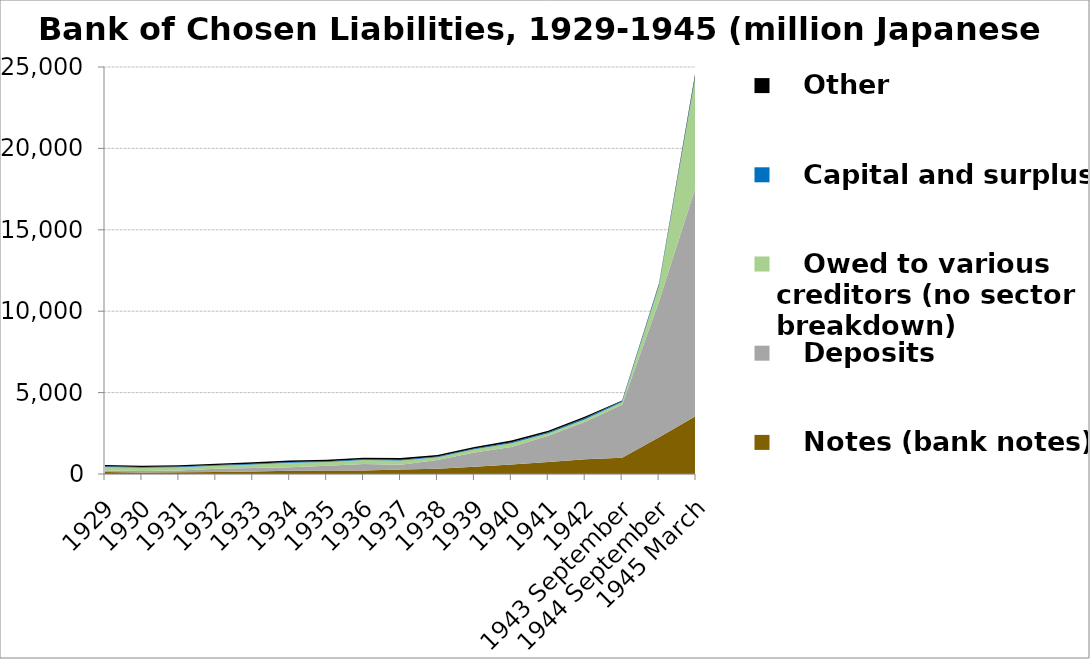
| Category |    Notes (bank notes) |    Deposits |    Owed to various creditors (no sector breakdown) |    Capital and surplus |    Other |
|---|---|---|---|---|---|
| 1929 | 118701945 | 103948052 | 210844237 | 43378242 | 82358871 |
| 1930 | 90615165 | 97785970 | 202318863 | 44139429 | 77744920 |
| 1931 | 100909791 | 111462998 | 200029860 | 44912171 | 74938043 |
| 1932 | 124622525 | 193932707 | 191344124 | 45710136 | 77691649 |
| 1933 | 148176012 | 215105319 | 213984486 | 46513817 | 93320372 |
| 1934 | 192457937 | 228193449 | 274645917 | 47325320 | 93005713 |
| 1935 | 220777273 | 292122354 | 221386786 | 48133584 | 94250701 |
| 1936 | 210653861 | 411142376 | 232044717 | 48937052 | 96245250 |
| 1937 | 279501840 | 293943646 | 253584079 | 49738878 | 99402216 |
| 1938 | 321977813 | 539653609 | 165517130 | 50740799 | 95341112 |
| 1939 | 443987608 | 881656182 | 193878388 | 52261898 | 92422489 |
| 1940 | 580533508 | 1073968154 | 237671709 | 54863143 | 106319967 |
| 1941 | 741606684 | 1611830864 | 156295711 | 59984485 | 89855385 |
| 1942 | 908646165 | 2306559805 | 154147832 | 66112217 | 98008089 |
| 1943 September | 995955015 | 3263603740 | 163106020 | 68612828 | 23546139 |
| 1944 September | 2256058029 | 8353599403 | 982021911 | 77439308 | 46940062 |
| 1945 March | 3574418246 | 14124305728 | 6958890416 | 121436236 | 113072849 |